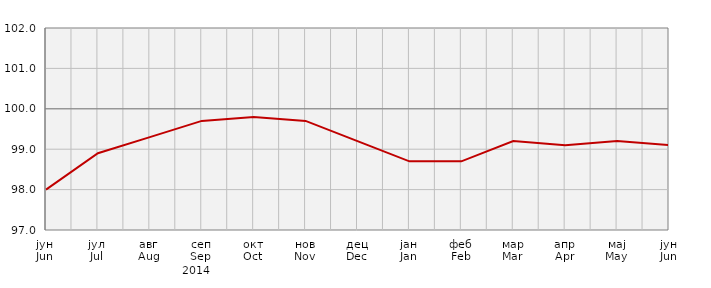
| Category | Индекси потрошачких цијена
Consumer price indices |
|---|---|
| јун
Jun | 98 |
| јул
Jul | 98.9 |
| авг
Aug | 99.3 |
| сеп
Sep | 99.7 |
| окт
Oct | 99.8 |
| нов
Nov | 99.7 |
| дец
Dec | 99.2 |
| јан
Jan | 98.7 |
| феб
Feb | 98.7 |
| мар
Mar | 99.2 |
| апр
Apr | 99.1 |
| мај
May | 99.2 |
| јун
Jun | 99.1 |